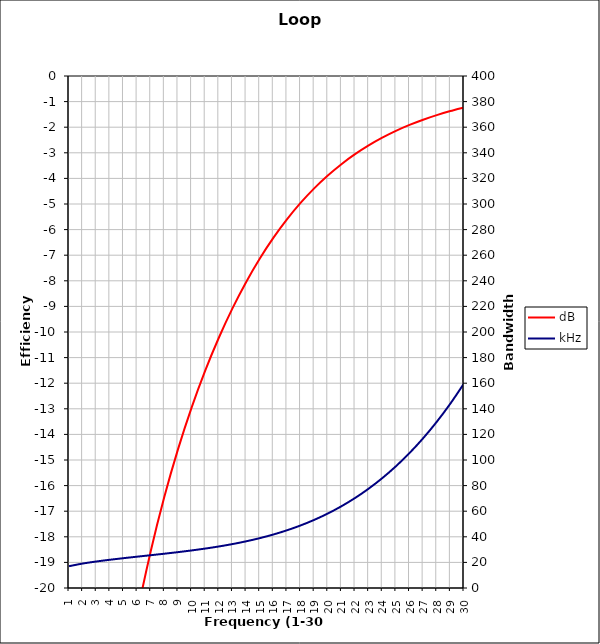
| Category | dB |
|---|---|
| 1.0 | -50.589 |
| 2.0 | -39.048 |
| 3.0 | -32.355 |
| 4.0 | -27.635 |
| 5.0 | -23.996 |
| 6.0 | -21.041 |
| 7.0 | -18.562 |
| 8.0 | -16.436 |
| 9.0 | -14.584 |
| 10.0 | -12.954 |
| 11.0 | -11.51 |
| 12.0 | -10.224 |
| 13.0 | -9.077 |
| 14.0 | -8.054 |
| 15.0 | -7.14 |
| 16.0 | -6.326 |
| 17.0 | -5.602 |
| 18.0 | -4.959 |
| 19.0 | -4.39 |
| 20.0 | -3.887 |
| 21.0 | -3.444 |
| 22.0 | -3.054 |
| 23.0 | -2.711 |
| 24.0 | -2.409 |
| 25.0 | -2.144 |
| 26.0 | -1.912 |
| 27.0 | -1.708 |
| 28.0 | -1.528 |
| 29.0 | -1.37 |
| 30.0 | -1.231 |